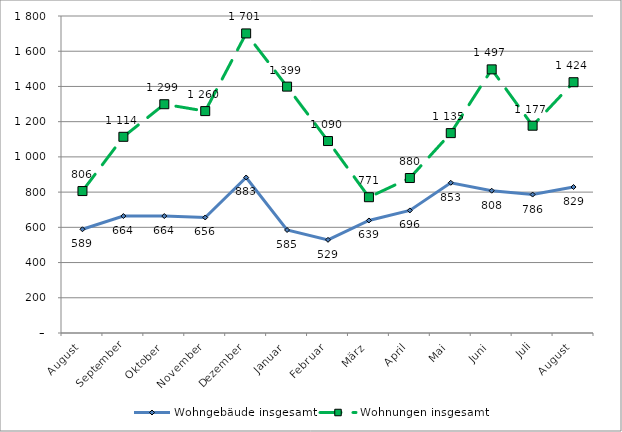
| Category | Wohngebäude insgesamt | Wohnungen insgesamt |
|---|---|---|
| August | 589 | 806 |
| September | 664 | 1114 |
| Oktober | 664 | 1299 |
| November | 656 | 1260 |
| Dezember | 883 | 1701 |
| Januar | 585 | 1399 |
| Februar | 529 | 1090 |
| März | 639 | 771 |
| April | 696 | 880 |
| Mai | 853 | 1135 |
| Juni | 808 | 1497 |
| Juli | 786 | 1177 |
| August | 829 | 1424 |